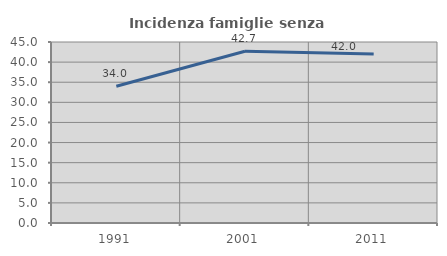
| Category | Incidenza famiglie senza nuclei |
|---|---|
| 1991.0 | 33.99 |
| 2001.0 | 42.714 |
| 2011.0 | 42.021 |